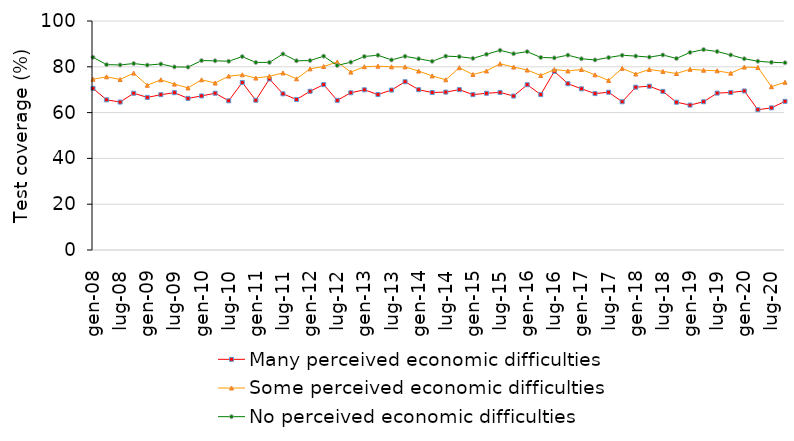
| Category | Many perceived economic difficulties | Some perceived economic difficulties | No perceived economic difficulties |
|---|---|---|---|
| gen-08 | 70.572 | 74.578 | 84.144 |
| apr-08 | 65.576 | 75.633 | 80.952 |
| lug-08 | 64.603 | 74.461 | 80.82 |
| ott-08 | 68.459 | 77.238 | 81.424 |
| gen-09 | 66.632 | 71.938 | 80.744 |
| apr-09 | 67.816 | 74.323 | 81.212 |
| lug-09 | 68.713 | 72.441 | 79.95 |
| ott-09 | 66.209 | 70.788 | 79.864 |
| gen-10 | 67.272 | 74.328 | 82.714 |
| apr-10 | 68.466 | 72.923 | 82.622 |
| lug-10 | 65.153 | 75.931 | 82.41 |
| ott-10 | 73.149 | 76.508 | 84.454 |
| gen-11 | 65.392 | 75.088 | 81.904 |
| apr-11 | 74.686 | 75.833 | 81.922 |
| lug-11 | 68.203 | 77.311 | 85.59 |
| ott-11 | 65.729 | 74.748 | 82.624 |
| gen-12 | 69.312 | 79.108 | 82.734 |
| apr-12 | 72.226 | 80.113 | 84.632 |
| lug-12 | 65.353 | 82.131 | 80.58 |
| ott-12 | 68.659 | 77.688 | 82.024 |
| gen-13 | 69.952 | 80.018 | 84.494 |
| apr-13 | 67.886 | 80.293 | 85.052 |
| lug-13 | 69.843 | 79.991 | 82.99 |
| ott-13 | 73.489 | 79.948 | 84.584 |
| gen-14 | 69.992 | 78.148 | 83.504 |
| apr-14 | 68.776 | 76.023 | 82.402 |
| lug-14 | 68.953 | 74.341 | 84.64 |
| ott-14 | 70.029 | 79.618 | 84.434 |
| gen-15 | 67.842 | 76.628 | 83.674 |
| apr-15 | 68.456 | 78.183 | 85.452 |
| lug-15 | 68.813 | 81.321 | 87.21 |
| ott-15 | 67.229 | 79.888 | 85.714 |
| gen-16 | 72.172 | 78.588 | 86.624 |
| apr-16 | 67.886 | 76.203 | 84.082 |
| lug-16 | 78.013 | 78.791 | 83.89 |
| ott-16 | 72.619 | 78.168 | 85.094 |
| gen-17 | 70.382 | 78.828 | 83.514 |
| apr-17 | 68.306 | 76.483 | 82.992 |
| lug-17 | 68.893 | 74.061 | 84.04 |
| ott-17 | 64.739 | 79.328 | 85.024 |
| gen-18 | 71.102 | 76.858 | 84.684 |
| apr-18 | 71.516 | 78.843 | 84.232 |
| lug-18 | 69.263 | 78.001 | 85.16 |
| ott-18 | 64.539 | 77.068 | 83.644 |
| gen-19 | 63.282 | 78.908 | 86.274 |
| apr-19 | 64.736 | 78.503 | 87.512 |
| lug-19 | 68.513 | 78.251 | 86.66 |
| ott-19 | 68.789 | 77.208 | 85.164 |
| gen-20 | 69.452 | 79.878 | 83.514 |
| apr-20 | 61.266 | 79.713 | 82.442 |
| lug-20 | 62.073 | 71.321 | 81.95 |
| ott-20 | 64.929 | 73.268 | 81.764 |